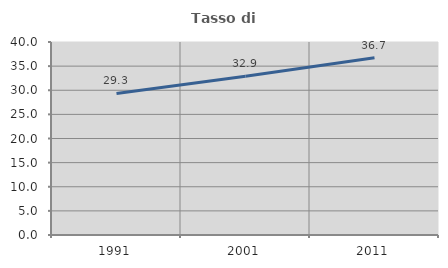
| Category | Tasso di occupazione   |
|---|---|
| 1991.0 | 29.347 |
| 2001.0 | 32.904 |
| 2011.0 | 36.72 |